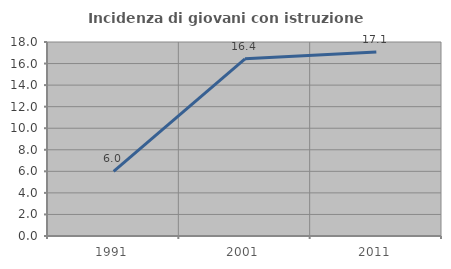
| Category | Incidenza di giovani con istruzione universitaria |
|---|---|
| 1991.0 | 6 |
| 2001.0 | 16.438 |
| 2011.0 | 17.073 |